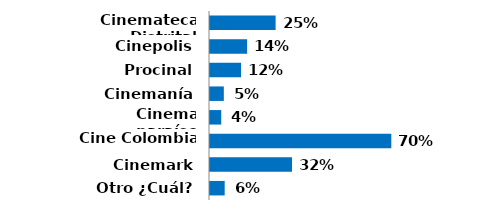
| Category | Series 0 |
|---|---|
| Cinemateca Distrital | 0.253 |
| Cinepolis | 0.143 |
| Procinal | 0.12 |
| Cinemanía | 0.053 |
| Cinema paraíso | 0.043 |
| Cine Colombia | 0.7 |
| Cinemark | 0.317 |
| Otro ¿Cuál? | 0.057 |